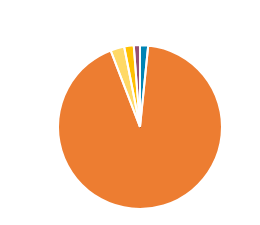
| Category | Series 0 |
|---|---|
| PC/MC | 325 |
| CAR/LGV | 18813 |
| OGV1 & PSV 2Axle | 554 |
| OGV1 & PSV 3 Axle | 383 |
| OGV2 | 248 |